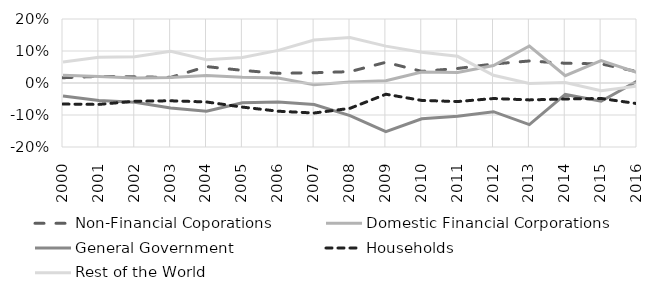
| Category | Non-Financial Coporations | Domestic Financial Corporations | General Government | Households | Rest of the World |
|---|---|---|---|---|---|
| 2000 | 0.016 | 0.024 | -0.041 | -0.066 | 0.066 |
| 2001 | 0.021 | 0.02 | -0.055 | -0.067 | 0.08 |
| 2002 | 0.019 | 0.016 | -0.06 | -0.057 | 0.082 |
| 2003 | 0.018 | 0.018 | -0.078 | -0.056 | 0.099 |
| 2004 | 0.051 | 0.023 | -0.088 | -0.059 | 0.073 |
| 2005 | 0.039 | 0.018 | -0.062 | -0.075 | 0.08 |
| 2006 | 0.03 | 0.016 | -0.059 | -0.088 | 0.102 |
| 2007 | 0.032 | -0.005 | -0.067 | -0.094 | 0.134 |
| 2008 | 0.036 | 0.003 | -0.102 | -0.079 | 0.142 |
| 2009 | 0.065 | 0.007 | -0.152 | -0.035 | 0.115 |
| 2010 | 0.036 | 0.034 | -0.112 | -0.054 | 0.096 |
| 2011 | 0.045 | 0.033 | -0.104 | -0.058 | 0.083 |
| 2012 | 0.059 | 0.055 | -0.09 | -0.049 | 0.024 |
| 2013 | 0.069 | 0.116 | -0.13 | -0.053 | -0.002 |
| 2014 | 0.062 | 0.023 | -0.036 | -0.05 | 0.001 |
| 2015 | 0.06 | 0.07 | -0.057 | -0.048 | -0.024 |
| 2016 | 0.036 | 0.033 | 0.005 | -0.064 | -0.009 |